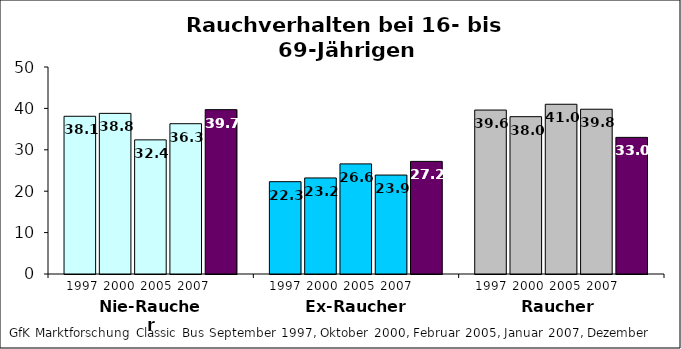
| Category | 1997 | 2000 | 2005 | 2007 | 2011 |
|---|---|---|---|---|---|
| Nie-Raucher | 38.1 | 38.8 | 32.4 | 36.3 | 39.7 |
| Ex-Raucher | 22.3 | 23.2 | 26.6 | 23.9 | 27.2 |
| Raucher | 39.6 | 38 | 41 | 39.8 | 33 |